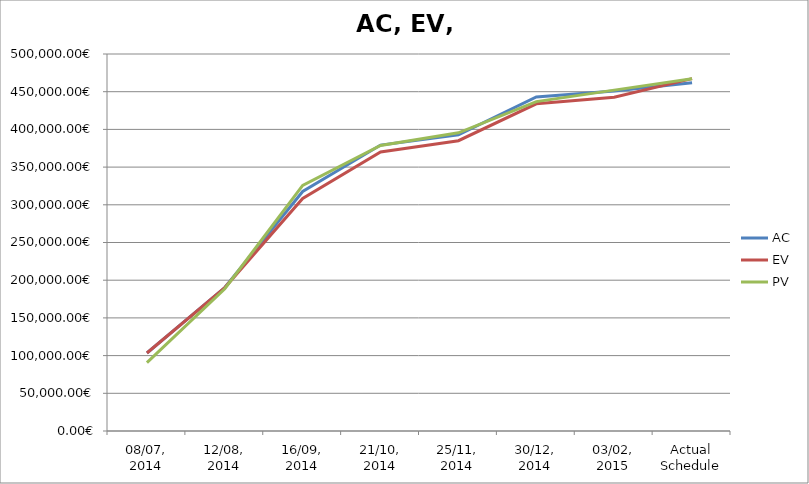
| Category | AC | EV | PV |
|---|---|---|---|
| 08/07, 2014 | 103464.001 | 103464.002 | 90660.321 |
| 12/08, 2014 | 190249.841 | 190249.841 | 188637.121 |
| 16/09, 2014 | 317609.123 | 308462.723 | 325752.323 |
| 21/10, 2014 | 379212.884 | 370066.484 | 378668.964 |
| 25/11, 2014 | 392807.924 | 384991.044 | 395477.684 |
| 30/12, 2014 | 443059.525 | 433963.765 | 436862.325 |
| 03/02, 2015 | 451030.565 | 442659.445 | 452079.765 |
| Actual Schedule | 461900.165 | 467297.205 | 467297.205 |